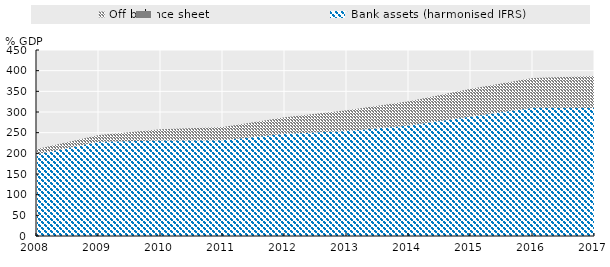
| Category | Bank assets (harmonised IFRS) | Off balance sheet |
|---|---|---|
| 2008.0 | 197.648 | 12.763 |
| 2009.0 | 227.782 | 16.525 |
| 2010.0 | 230.747 | 27.652 |
| 2011.0 | 231.529 | 31.901 |
| 2012.0 | 247.281 | 39.996 |
| 2013.0 | 254.273 | 50.154 |
| 2014.0 | 267.613 | 58.121 |
| 2015.0 | 289.304 | 66.76 |
| 2016.0 | 310.445 | 72.039 |
| 2017.0 | 309.511 | 77.444 |